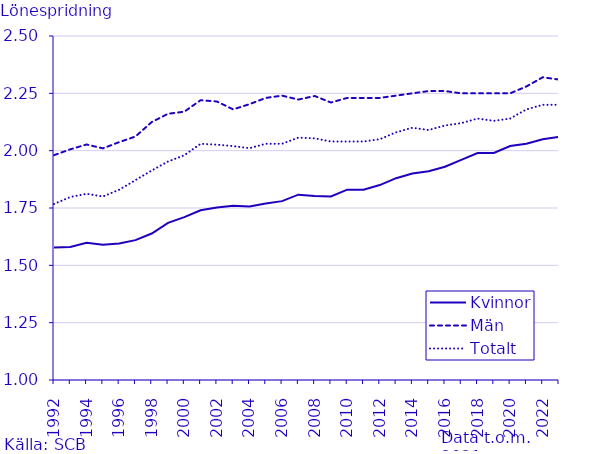
| Category | Kvinnor | Män | Totalt |
|---|---|---|---|
| 1992.0 | 1.578 | 1.98 | 1.768 |
| 1993.0 | 1.58 | 2.006 | 1.798 |
| 1994.0 | 1.598 | 2.027 | 1.812 |
| 1995.0 | 1.59 | 2.01 | 1.8 |
| 1996.0 | 1.596 | 2.037 | 1.83 |
| 1997.0 | 1.61 | 2.062 | 1.871 |
| 1998.0 | 1.639 | 2.125 | 1.914 |
| 1999.0 | 1.685 | 2.161 | 1.953 |
| 2000.0 | 1.71 | 2.17 | 1.98 |
| 2001.0 | 1.74 | 2.22 | 2.03 |
| 2002.0 | 1.752 | 2.214 | 2.026 |
| 2003.0 | 1.76 | 2.18 | 2.02 |
| 2004.0 | 1.756 | 2.203 | 2.011 |
| 2005.0 | 1.77 | 2.23 | 2.03 |
| 2006.0 | 1.78 | 2.24 | 2.03 |
| 2007.0 | 1.808 | 2.223 | 2.057 |
| 2008.0 | 1.802 | 2.238 | 2.054 |
| 2009.0 | 1.8 | 2.21 | 2.04 |
| 2010.0 | 1.83 | 2.23 | 2.04 |
| 2011.0 | 1.83 | 2.23 | 2.04 |
| 2012.0 | 1.85 | 2.23 | 2.05 |
| 2013.0 | 1.88 | 2.24 | 2.08 |
| 2014.0 | 1.9 | 2.25 | 2.1 |
| 2015.0 | 1.91 | 2.26 | 2.09 |
| 2016.0 | 1.93 | 2.26 | 2.11 |
| 2017.0 | 1.96 | 2.25 | 2.12 |
| 2018.0 | 1.99 | 2.25 | 2.14 |
| 2019.0 | 1.99 | 2.25 | 2.13 |
| 2020.0 | 2.02 | 2.25 | 2.14 |
| 2021.0 | 2.03 | 2.28 | 2.18 |
| 2022.0 | 2.05 | 2.32 | 2.2 |
| 2023.0 | 2.06 | 2.31 | 2.2 |